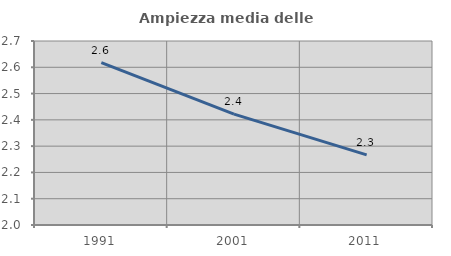
| Category | Ampiezza media delle famiglie |
|---|---|
| 1991.0 | 2.617 |
| 2001.0 | 2.422 |
| 2011.0 | 2.267 |